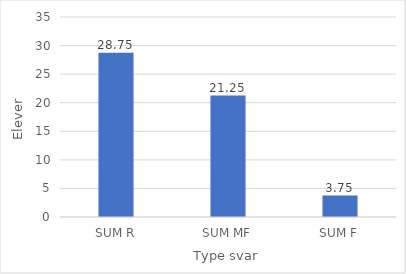
| Category | Series 0 |
|---|---|
| SUM R | 28.75 |
| SUM MF | 21.25 |
| SUM F | 3.75 |